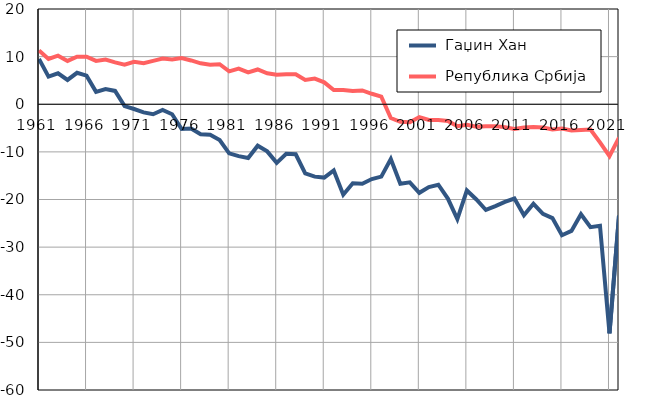
| Category |  Гаџин Хан |  Република Србија |
|---|---|---|
| 1961.0 | 9.5 | 11.3 |
| 1962.0 | 5.8 | 9.5 |
| 1963.0 | 6.5 | 10.2 |
| 1964.0 | 5.1 | 9.1 |
| 1965.0 | 6.6 | 10 |
| 1966.0 | 6 | 10 |
| 1967.0 | 2.6 | 9.1 |
| 1968.0 | 3.2 | 9.4 |
| 1969.0 | 2.8 | 8.8 |
| 1970.0 | -0.4 | 8.3 |
| 1971.0 | -1 | 8.9 |
| 1972.0 | -1.7 | 8.6 |
| 1973.0 | -2.1 | 9.1 |
| 1974.0 | -1.2 | 9.6 |
| 1975.0 | -2.1 | 9.4 |
| 1976.0 | -5.2 | 9.7 |
| 1977.0 | -5.1 | 9.2 |
| 1978.0 | -6.3 | 8.6 |
| 1979.0 | -6.4 | 8.3 |
| 1980.0 | -7.5 | 8.4 |
| 1981.0 | -10.3 | 6.9 |
| 1982.0 | -10.9 | 7.5 |
| 1983.0 | -11.3 | 6.7 |
| 1984.0 | -8.7 | 7.3 |
| 1985.0 | -9.9 | 6.5 |
| 1986.0 | -12.3 | 6.2 |
| 1987.0 | -10.4 | 6.3 |
| 1988.0 | -10.5 | 6.3 |
| 1989.0 | -14.5 | 5.1 |
| 1990.0 | -15.2 | 5.4 |
| 1991.0 | -15.4 | 4.6 |
| 1992.0 | -13.9 | 3 |
| 1993.0 | -19 | 3 |
| 1994.0 | -16.6 | 2.8 |
| 1995.0 | -16.7 | 2.9 |
| 1996.0 | -15.7 | 2.2 |
| 1997.0 | -15.2 | 1.6 |
| 1998.0 | -11.5 | -2.9 |
| 1999.0 | -16.7 | -3.7 |
| 2000.0 | -16.4 | -3.8 |
| 2001.0 | -18.6 | -2.7 |
| 2002.0 | -17.4 | -3.3 |
| 2003.0 | -16.9 | -3.3 |
| 2004.0 | -19.8 | -3.5 |
| 2005.0 | -24.1 | -4.6 |
| 2006.0 | -18.1 | -4.3 |
| 2007.0 | -20 | -4.7 |
| 2008.0 | -22.2 | -4.6 |
| 2009.0 | -21.4 | -4.6 |
| 2010.0 | -20.5 | -4.8 |
| 2011.0 | -19.8 | -5.2 |
| 2012.0 | -23.3 | -4.9 |
| 2013.0 | -20.9 | -4.8 |
| 2014.0 | -23 | -4.9 |
| 2015.0 | -23.9 | -5.3 |
| 2016.0 | -27.5 | -5.1 |
| 2017.0 | -26.6 | -5.5 |
| 2018.0 | -23.1 | -5.4 |
| 2019.0 | -25.8 | -5.3 |
| 2020.0 | -25.5 | -8 |
| 2021.0 | -48.1 | -10.9 |
| 2022.0 | -23.4 | -7 |